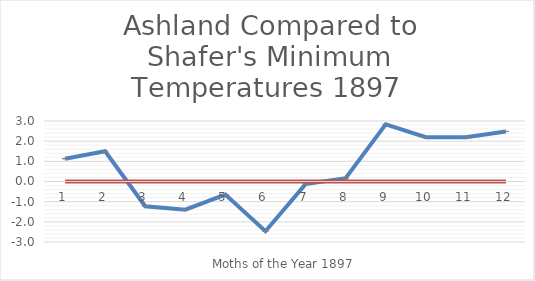
| Category | Series 0 | Series 1 |
|---|---|---|
| 0 | 1.129 | 0 |
| 1 | 1.5 | 0 |
| 2 | -1.226 | 0 |
| 3 | -1.4 | 0 |
| 4 | -0.645 | 0 |
| 5 | -2.467 | 0 |
| 6 | -0.129 | 0 |
| 7 | 0.161 | 0 |
| 8 | 2.833 | 0 |
| 9 | 2.194 | 0 |
| 10 | 2.2 | 0 |
| 11 | 2.484 | 0 |